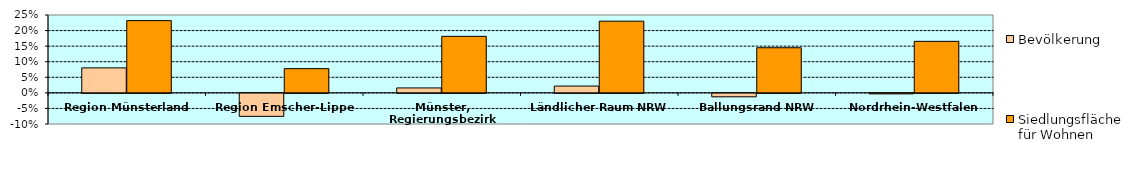
| Category | Bevölkerung | Siedlungsfläche für Wohnen |
|---|---|---|
| Region Münsterland | 0.08 | 0.232 |
| Region Emscher-Lippe | -0.074 | 0.078 |
| Münster, Regierungsbezirk | 0.016 | 0.181 |
| Ländlicher Raum NRW | 0.022 | 0.23 |
| Ballungsrand NRW | -0.011 | 0.145 |
| Nordrhein-Westfalen | -0.002 | 0.165 |